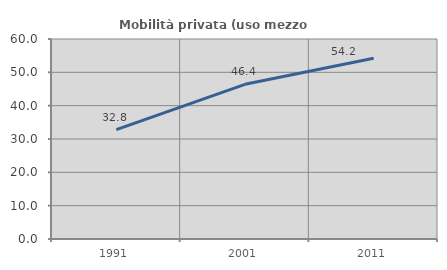
| Category | Mobilità privata (uso mezzo privato) |
|---|---|
| 1991.0 | 32.787 |
| 2001.0 | 46.407 |
| 2011.0 | 54.201 |